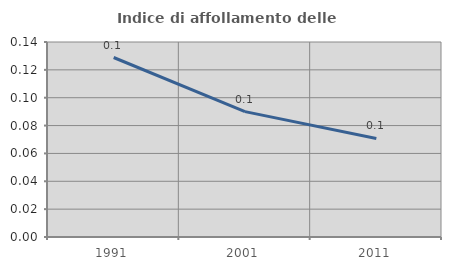
| Category | Indice di affollamento delle abitazioni  |
|---|---|
| 1991.0 | 0.129 |
| 2001.0 | 0.09 |
| 2011.0 | 0.071 |